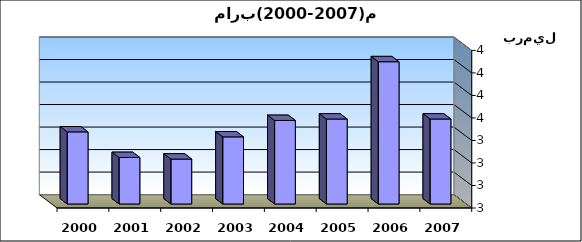
| Category | الكمية برميل  |
|---|---|
| 2000.0 | 3420220 |
| 2001.0 | 3306528 |
| 2002.0 | 3299477 |
| 2003.0 | 3398072 |
| 2004.0 | 3470951 |
| 2005.0 | 3477399 |
| 2006.0 | 3731818 |
| 2007.0 | 3477399 |